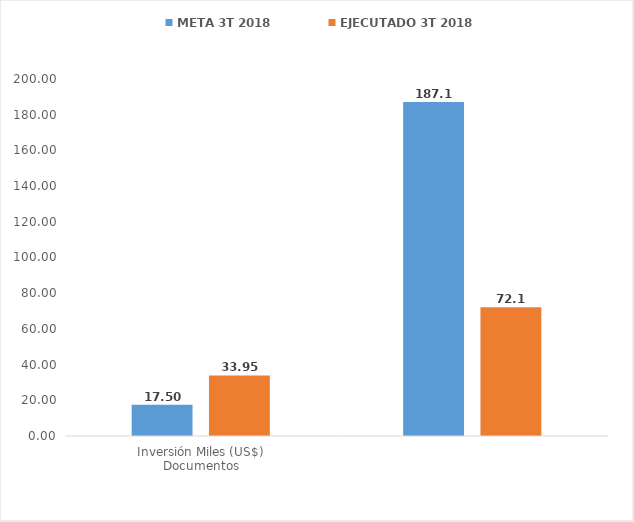
| Category | META 3T 2018 | EJECUTADO 3T 2018 |
|---|---|---|
| 0 | 17.5 | 33.95 |
| 1 | 187.051 | 72.129 |